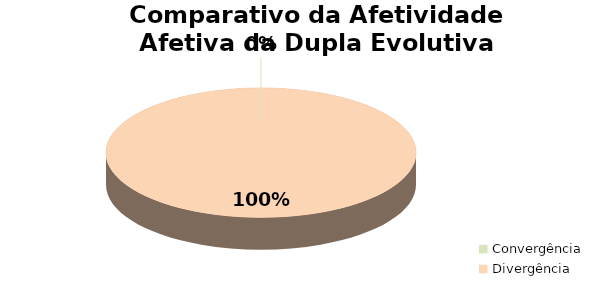
| Category | Series 0 |
|---|---|
| Convergência | 0 |
| Divergência | 25 |